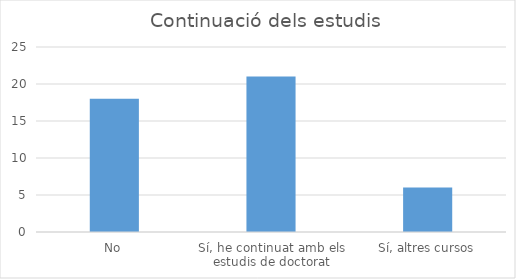
| Category | Series 0 |
|---|---|
| No | 18 |
| Sí, he continuat amb els estudis de doctorat | 21 |
| Sí, altres cursos | 6 |